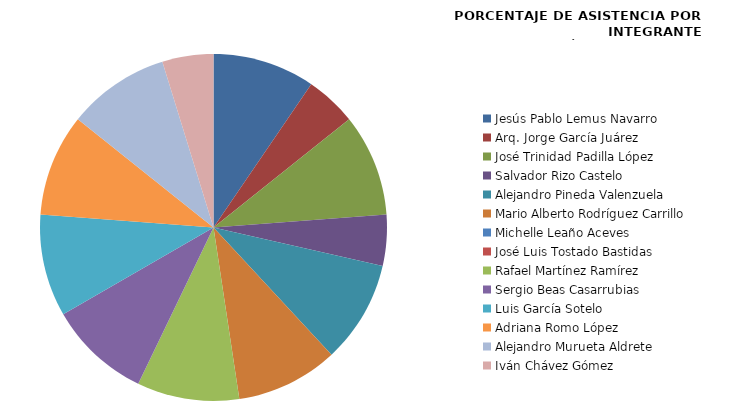
| Category | Series 0 |
|---|---|
| Jesús Pablo Lemus Navarro | 100 |
| Arq. Jorge García Juárez | 50 |
| José Trinidad Padilla López | 100 |
| Salvador Rizo Castelo | 50 |
| Alejandro Pineda Valenzuela | 100 |
| Mario Alberto Rodríguez Carrillo | 100 |
| Michelle Leaño Aceves | 0 |
| José Luis Tostado Bastidas | 0 |
| Rafael Martínez Ramírez | 100 |
| Sergio Beas Casarrubias | 100 |
| Luis García Sotelo | 100 |
| Adriana Romo López | 100 |
| Alejandro Murueta Aldrete | 100 |
| Iván Chávez Gómez | 50 |